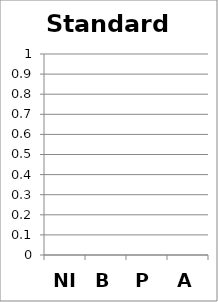
| Category | Standard 9 |
|---|---|
| NI | 0 |
| B | 0 |
| P | 0 |
| A | 0 |